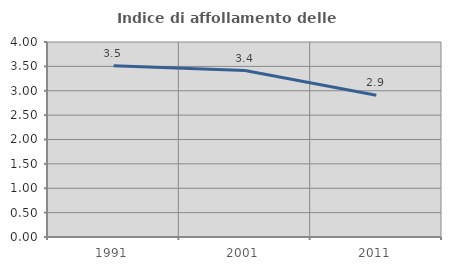
| Category | Indice di affollamento delle abitazioni  |
|---|---|
| 1991.0 | 3.511 |
| 2001.0 | 3.414 |
| 2011.0 | 2.906 |